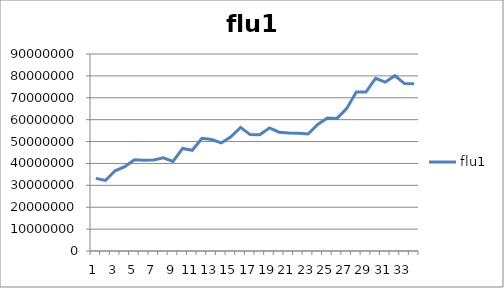
| Category | flu1 |
|---|---|
| 0 | 33185670 |
| 1 | 32217837 |
| 2 | 36641966.333 |
| 3 | 38526173.333 |
| 4 | 41692458.667 |
| 5 | 41471217 |
| 6 | 41546607.333 |
| 7 | 42581407.333 |
| 8 | 40946383 |
| 9 | 46855668.333 |
| 10 | 46025967.667 |
| 11 | 51471709 |
| 12 | 50899679 |
| 13 | 49358216 |
| 14 | 52144560 |
| 15 | 56460896.333 |
| 16 | 53182178.333 |
| 17 | 53098128.333 |
| 18 | 56245179 |
| 19 | 54288083.667 |
| 20 | 53915997 |
| 21 | 53771731.667 |
| 22 | 53440914 |
| 23 | 57777759 |
| 24 | 60732398 |
| 25 | 60578035.667 |
| 26 | 65028689.333 |
| 27 | 72666964 |
| 28 | 72589938.333 |
| 29 | 78917273.333 |
| 30 | 77125804.333 |
| 31 | 80071508.333 |
| 32 | 76496783.667 |
| 33 | 76406892.333 |